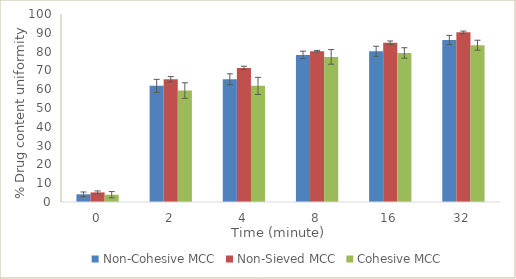
| Category | Non-Cohesive MCC | Non-Sieved MCC | Cohesive MCC |
|---|---|---|---|
| 0.0 | 4.11 | 5.11 | 3.89 |
| 2.0 | 61.77 | 65.27 | 59.28 |
| 4.0 | 65.28 | 71.33 | 61.77 |
| 8.0 | 78.25 | 80.18 | 77.19 |
| 16.0 | 80.17 | 84.66 | 79.28 |
| 32.0 | 86.19 | 90.23 | 83.4 |